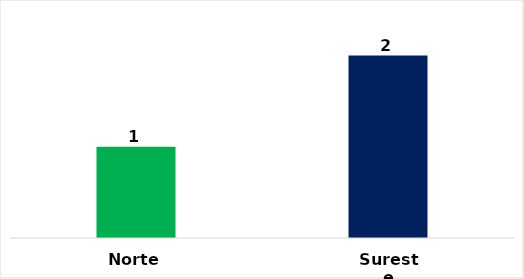
| Category | Total |
|---|---|
| Norte | 1 |
| Sureste | 2 |